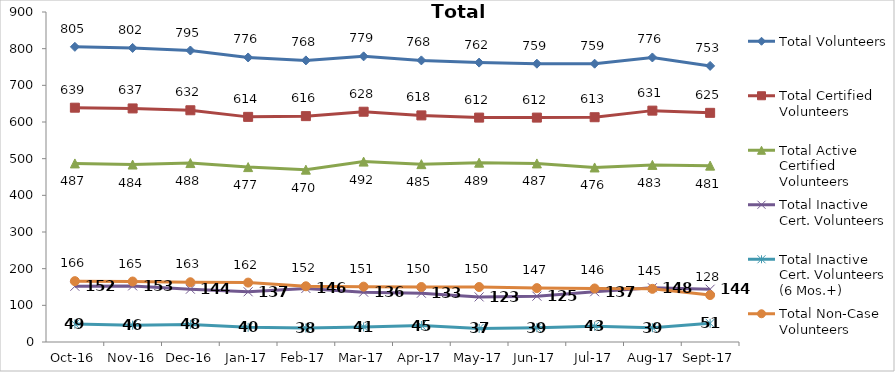
| Category | Total Volunteers | Total Certified Volunteers | Total Active Certified Volunteers | Total Inactive Cert. Volunteers | Total Inactive Cert. Volunteers (6 Mos.+) | Total Non-Case Volunteers |
|---|---|---|---|---|---|---|
| 2016-10-01 | 805 | 639 | 487 | 152 | 49 | 166 |
| 2016-11-01 | 802 | 637 | 484 | 153 | 46 | 165 |
| 2016-12-01 | 795 | 632 | 488 | 144 | 48 | 163 |
| 2017-01-01 | 776 | 614 | 477 | 137 | 40 | 162 |
| 2017-02-01 | 768 | 616 | 470 | 146 | 38 | 152 |
| 2017-03-01 | 779 | 628 | 492 | 136 | 41 | 151 |
| 2017-04-01 | 768 | 618 | 485 | 133 | 45 | 150 |
| 2017-05-01 | 762 | 612 | 489 | 123 | 37 | 150 |
| 2017-06-01 | 759 | 612 | 487 | 125 | 39 | 147 |
| 2017-07-01 | 759 | 613 | 476 | 137 | 43 | 146 |
| 2017-08-01 | 776 | 631 | 483 | 148 | 39 | 145 |
| 2017-09-01 | 753 | 625 | 481 | 144 | 51 | 128 |